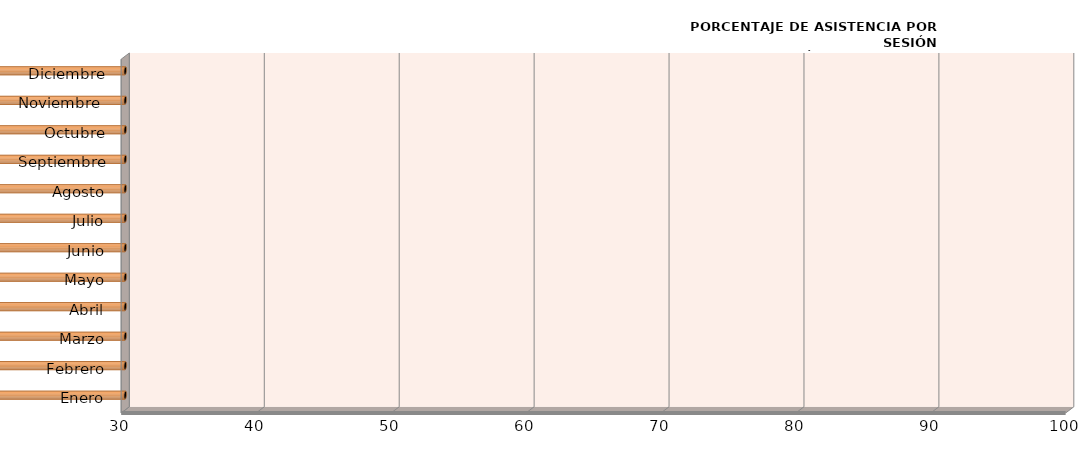
| Category | Series 0 |
|---|---|
| Enero | 0 |
| Febrero | 0 |
| Marzo | 0 |
| Abril | 0 |
| Mayo | 0 |
| Junio | 0 |
| Julio | 0 |
| Agosto | 0 |
| Septiembre | 0 |
| Octubre | 0 |
| Noviembre  | 0 |
| Diciembre | 0 |